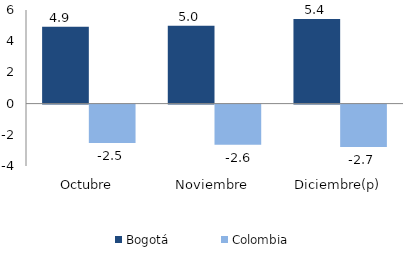
| Category | Bogotá | Colombia |
|---|---|---|
| Octubre | 4.924 | -2.457 |
| Noviembre | 4.99 | -2.581 |
| Diciembre(p) | 5.425 | -2.723 |